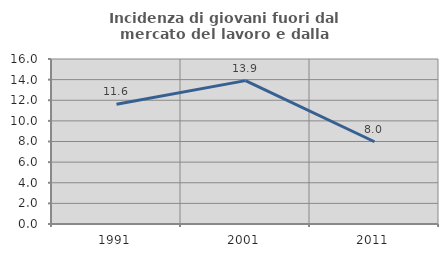
| Category | Incidenza di giovani fuori dal mercato del lavoro e dalla formazione  |
|---|---|
| 1991.0 | 11.616 |
| 2001.0 | 13.901 |
| 2011.0 | 7.975 |